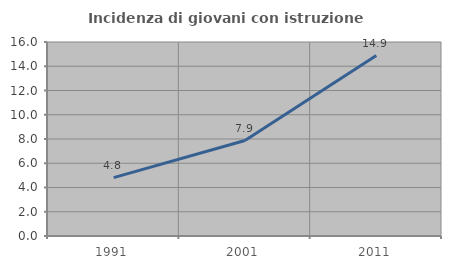
| Category | Incidenza di giovani con istruzione universitaria |
|---|---|
| 1991.0 | 4.818 |
| 2001.0 | 7.871 |
| 2011.0 | 14.884 |